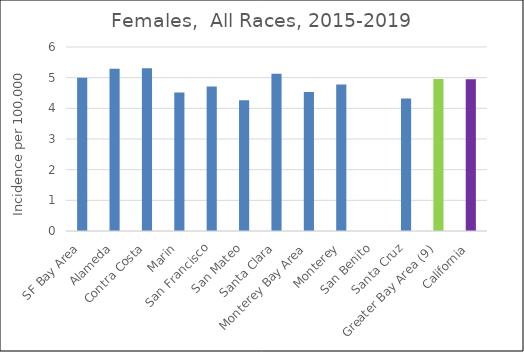
| Category | Female |
|---|---|
| SF Bay Area | 5 |
|   Alameda | 5.29 |
|   Contra Costa | 5.31 |
|   Marin | 4.52 |
|   San Francisco | 4.71 |
|   San Mateo | 4.26 |
|   Santa Clara | 5.13 |
| Monterey Bay Area | 4.53 |
|   Monterey | 4.78 |
|   San Benito | 0 |
|   Santa Cruz | 4.32 |
| Greater Bay Area (9) | 4.96 |
| California | 4.95 |